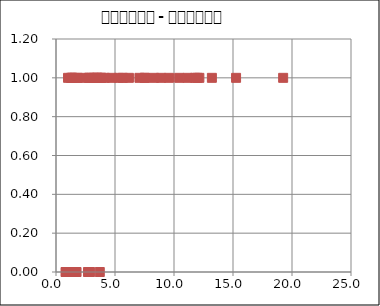
| Category | Series 1 |
|---|---|
| 19.25 | 1 |
| 7.53 | 1 |
| 5.66 | 1 |
| 3.21 | 1 |
| 2.8 | 1 |
| 1.41 | 1 |
| 6.18 | 1 |
| 12.15 | 1 |
| 1.34 | 1 |
| 3.71 | 0 |
| 5.35 | 1 |
| 4.72 | 1 |
| 3.81 | 1 |
| 10.44 | 1 |
| 9.58 | 1 |
| 1.02 | 1 |
| 7.52 | 1 |
| 1.31 | 0 |
| 1.67 | 0 |
| 7.07 | 1 |
| 11.79 | 1 |
| 2.71 | 0 |
| 13.21 | 1 |
| 3.48 | 1 |
| 0.81 | 0 |
| 2.32 | 1 |
| 3.47 | 1 |
| 8.31 | 1 |
| 1.57 | 1 |
| 4.13 | 1 |
| 3.84 | 1 |
| 1.83 | 1 |
| 3.54 | 1 |
| 1.11 | 0 |
| 8.9 | 1 |
| 1.27 | 1 |
| 15.26 | 1 |
| 11.15 | 1 |
| 1.74 | 0 |
| 11.98 | 1 |
| 3.04 | 1 |
| 0.85 | 0 |
| 2.83 | 1 |
| 2.89 | 0 |